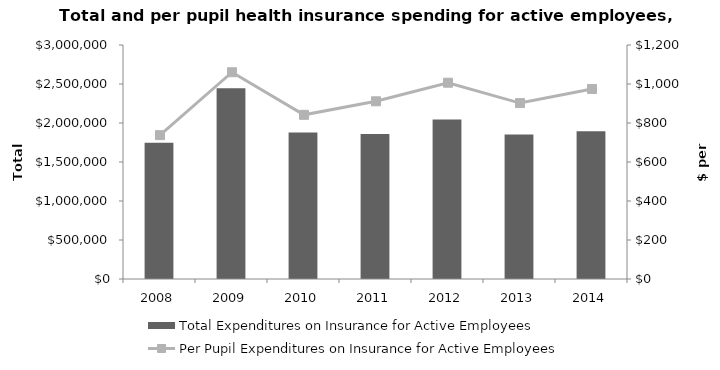
| Category | Total Expenditures on Insurance for Active Employees |
|---|---|
| 0 | 1747164 |
| 1 | 2445263 |
| 2 | 1876634 |
| 3 | 1857776.45 |
| 4 | 2045157.95 |
| 5 | 1851435.75 |
| 6 | 1893609.97 |